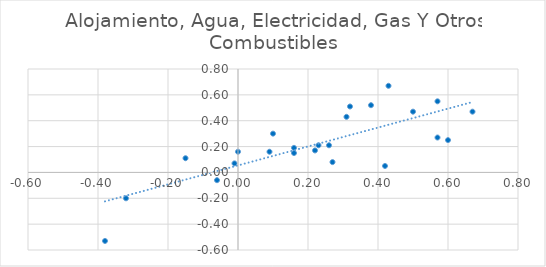
| Category | Alojamiento, Agua, Electricidad, Gas Y Otros Combustibles |
|---|---|
| 0.38 | 0.52 |
| -0.15 | 0.11 |
| -0.06 | -0.06 |
| 0.32 | 0.51 |
| -0.01 | 0.07 |
| 0.0 | 0.16 |
| -0.38 | -0.53 |
| -0.32 | -0.2 |
| 0.16 | 0.15 |
| 0.57 | 0.55 |
| 0.67 | 0.47 |
| 0.42 | 0.05 |
| 0.26 | 0.21 |
| 0.1 | 0.3 |
| 0.16 | 0.19 |
| 0.23 | 0.21 |
| 0.09 | 0.16 |
| 0.22 | 0.17 |
| 0.27 | 0.08 |
| 0.31 | 0.43 |
| 0.5 | 0.47 |
| 0.43 | 0.67 |
| 0.57 | 0.27 |
| 0.6 | 0.25 |